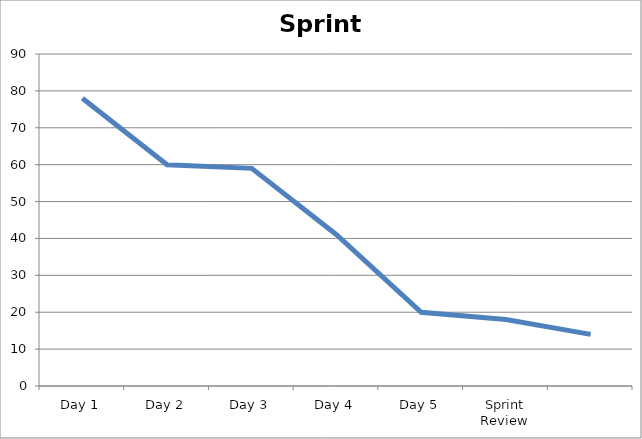
| Category | Sprint Burndown Chart |
|---|---|
| Day 1 | 78 |
| Day 2 | 60 |
| Day 3 | 59 |
| Day 4 | 41 |
| Day 5 | 20 |
| Sprint Review | 18 |